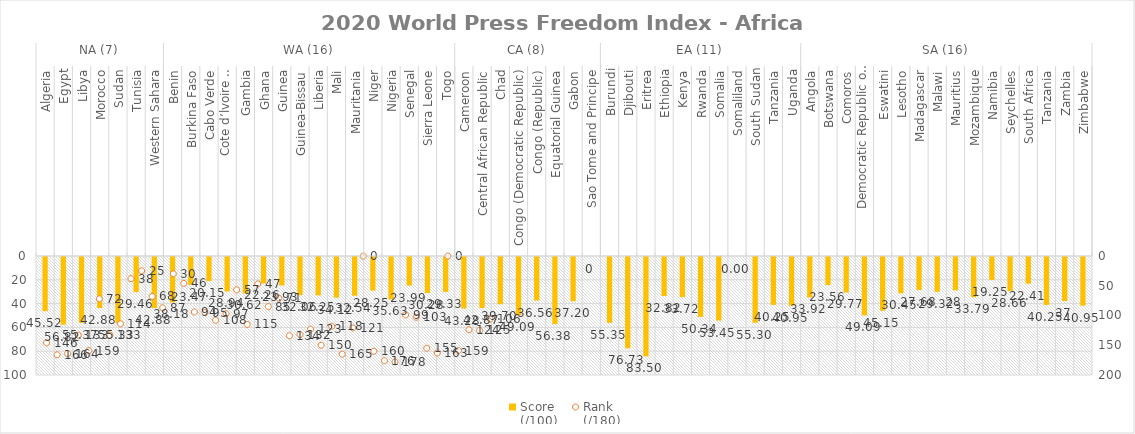
| Category | Score
(/100) |
|---|---|
| 0 | 45.52 |
| 1 | 56.82 |
| 2 | 55.37 |
| 3 | 42.88 |
| 4 | 55.33 |
| 5 | 29.46 |
| 6 | 42.88 |
| 7 | 38.18 |
| 8 | 23.47 |
| 9 | 20.15 |
| 10 | 28.94 |
| 11 | 30.62 |
| 12 | 22.26 |
| 13 | 23.93 |
| 14 | 32.06 |
| 15 | 32.25 |
| 16 | 34.12 |
| 17 | 32.54 |
| 18 | 28.25 |
| 19 | 35.63 |
| 20 | 23.99 |
| 21 | 30.28 |
| 22 | 29.33 |
| 23 | 43.28 |
| 24 | 42.87 |
| 25 | 39.7 |
| 26 | 49.09 |
| 27 | 36.56 |
| 28 | 56.38 |
| 29 | 37.2 |
| 30 | 0 |
| 31 | 55.35 |
| 32 | 76.73 |
| 33 | 83.5 |
| 34 | 32.82 |
| 35 | 33.72 |
| 36 | 50.34 |
| 37 | 53.45 |
| 38 | 0 |
| 39 | 55.3 |
| 40 | 40.25 |
| 41 | 40.95 |
| 42 | 33.92 |
| 43 | 23.56 |
| 44 | 29.77 |
| 45 | 49.09 |
| 46 | 45.15 |
| 47 | 30.45 |
| 48 | 27.68 |
| 49 | 29.32 |
| 50 | 28 |
| 51 | 33.79 |
| 52 | 19.25 |
| 53 | 28.66 |
| 54 | 22.41 |
| 55 | 40.25 |
| 56 | 37 |
| 57 | 40.95 |